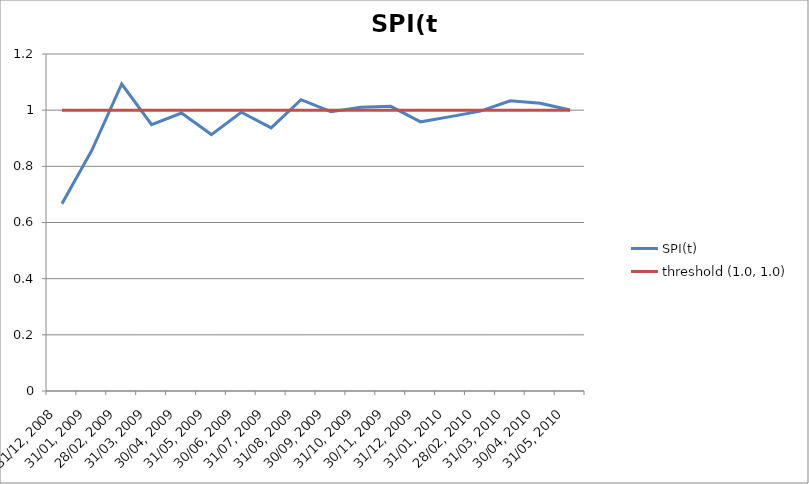
| Category | SPI(t) | threshold (1.0, 1.0) |
|---|---|---|
| 31/12, 2008 | 0.667 | 1 |
| 31/01, 2009 | 0.857 | 1 |
| 28/02, 2009 | 1.093 | 1 |
| 31/03, 2009 | 0.948 | 1 |
| 30/04, 2009 | 0.99 | 1 |
| 31/05, 2009 | 0.913 | 1 |
| 30/06, 2009 | 0.993 | 1 |
| 31/07, 2009 | 0.937 | 1 |
| 31/08, 2009 | 1.037 | 1 |
| 30/09, 2009 | 0.995 | 1 |
| 31/10, 2009 | 1.01 | 1 |
| 30/11, 2009 | 1.014 | 1 |
| 31/12, 2009 | 0.959 | 1 |
| 31/01, 2010 | 0.977 | 1 |
| 28/02, 2010 | 0.996 | 1 |
| 31/03, 2010 | 1.033 | 1 |
| 30/04, 2010 | 1.025 | 1 |
| 31/05, 2010 | 1 | 1 |